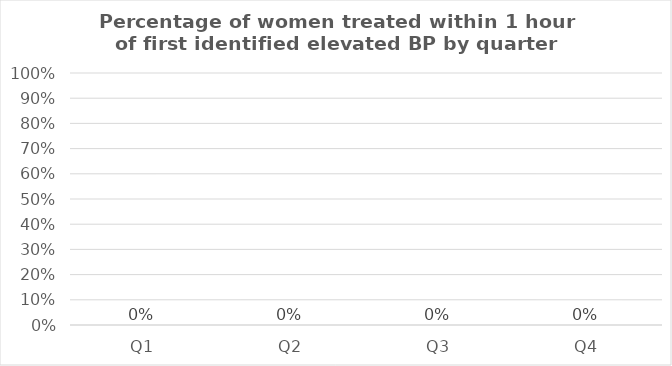
| Category | Percentage of women treated within 1 hour of first identified elevated BP |
|---|---|
| Q1 | 0 |
| Q2 | 0 |
| Q3 | 0 |
| Q4 | 0 |